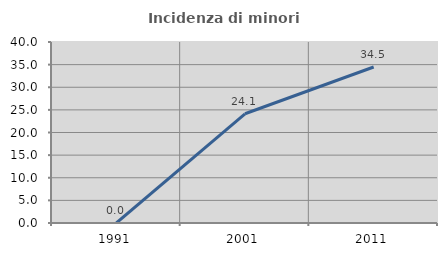
| Category | Incidenza di minori stranieri |
|---|---|
| 1991.0 | 0 |
| 2001.0 | 24.138 |
| 2011.0 | 34.483 |